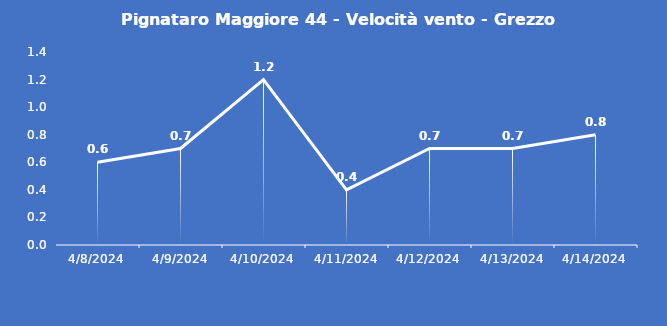
| Category | Pignataro Maggiore 44 - Velocità vento - Grezzo (m/s) |
|---|---|
| 4/8/24 | 0.6 |
| 4/9/24 | 0.7 |
| 4/10/24 | 1.2 |
| 4/11/24 | 0.4 |
| 4/12/24 | 0.7 |
| 4/13/24 | 0.7 |
| 4/14/24 | 0.8 |